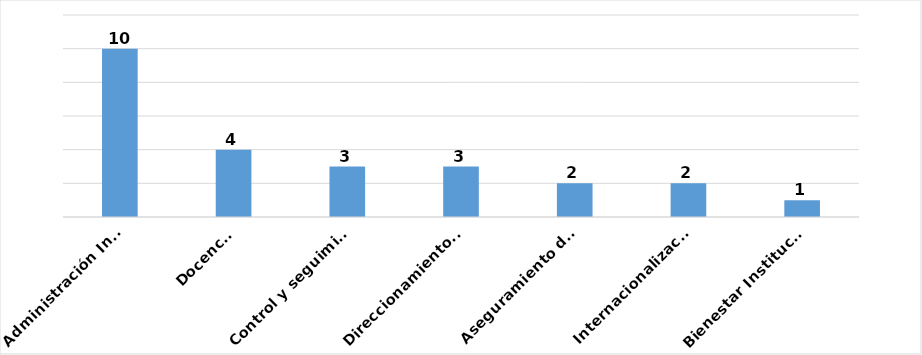
| Category | Series 0 |
|---|---|
| Administración Institucional | 10 |
| Docencia | 4 |
| Control y seguimiento Institucional | 3 |
| Direccionamiento institucional | 3 |
| Aseguramiento de la calidad institucional | 2 |
| Internacionalización | 2 |
| Bienestar Institucional | 1 |